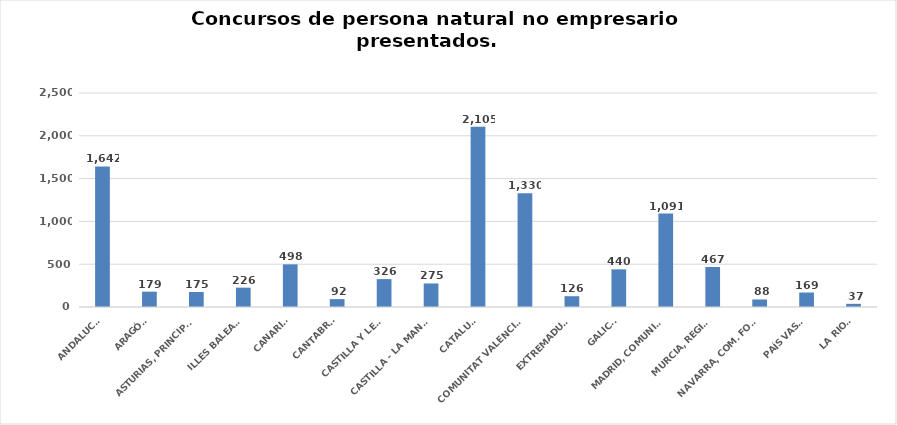
| Category | Series 0 |
|---|---|
| ANDALUCÍA | 1642 |
| ARAGÓN | 179 |
| ASTURIAS, PRINCIPADO | 175 |
| ILLES BALEARS | 226 |
| CANARIAS | 498 |
| CANTABRIA | 92 |
| CASTILLA Y LEÓN | 326 |
| CASTILLA - LA MANCHA | 275 |
| CATALUÑA | 2105 |
| COMUNITAT VALENCIANA | 1330 |
| EXTREMADURA | 126 |
| GALICIA | 440 |
| MADRID, COMUNIDAD | 1091 |
| MURCIA, REGIÓN | 467 |
| NAVARRA, COM. FORAL | 88 |
| PAÍS VASCO | 169 |
| LA RIOJA | 37 |